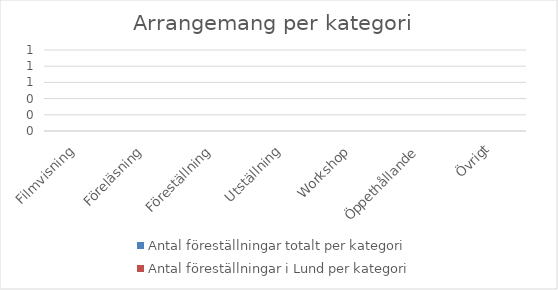
| Category | Antal föreställningar totalt per kategori | Antal föreställningar i Lund per kategori |
|---|---|---|
| Filmvisning | 0 | 0 |
| Föreläsning | 0 | 0 |
| Föreställning | 0 | 0 |
| Utställning | 0 | 0 |
| Workshop | 0 | 0 |
| Öppethållande | 0 | 0 |
| Övrigt | 0 | 0 |